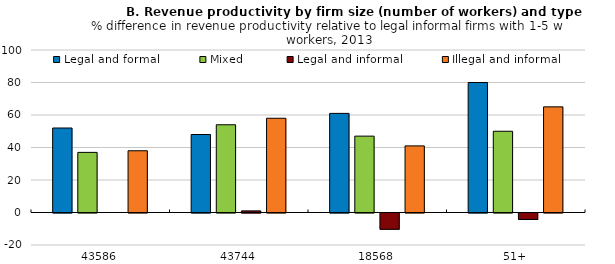
| Category | Legal and formal | Mixed | Legal and informal | Illegal and informal |
|---|---|---|---|---|
| 43586 | 52 | 37 | 0 | 38 |
| 43744 | 48 | 54 | 1 | 58 |
| 18568 | 61 | 47 | -10 | 41 |
| 51+ | 80 | 50 | -4 | 65 |